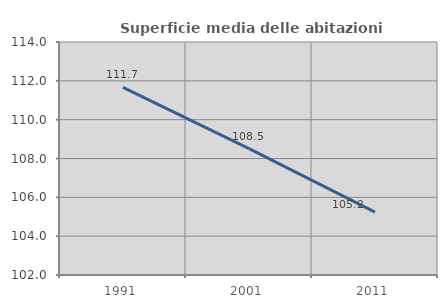
| Category | Superficie media delle abitazioni occupate |
|---|---|
| 1991.0 | 111.662 |
| 2001.0 | 108.508 |
| 2011.0 | 105.239 |